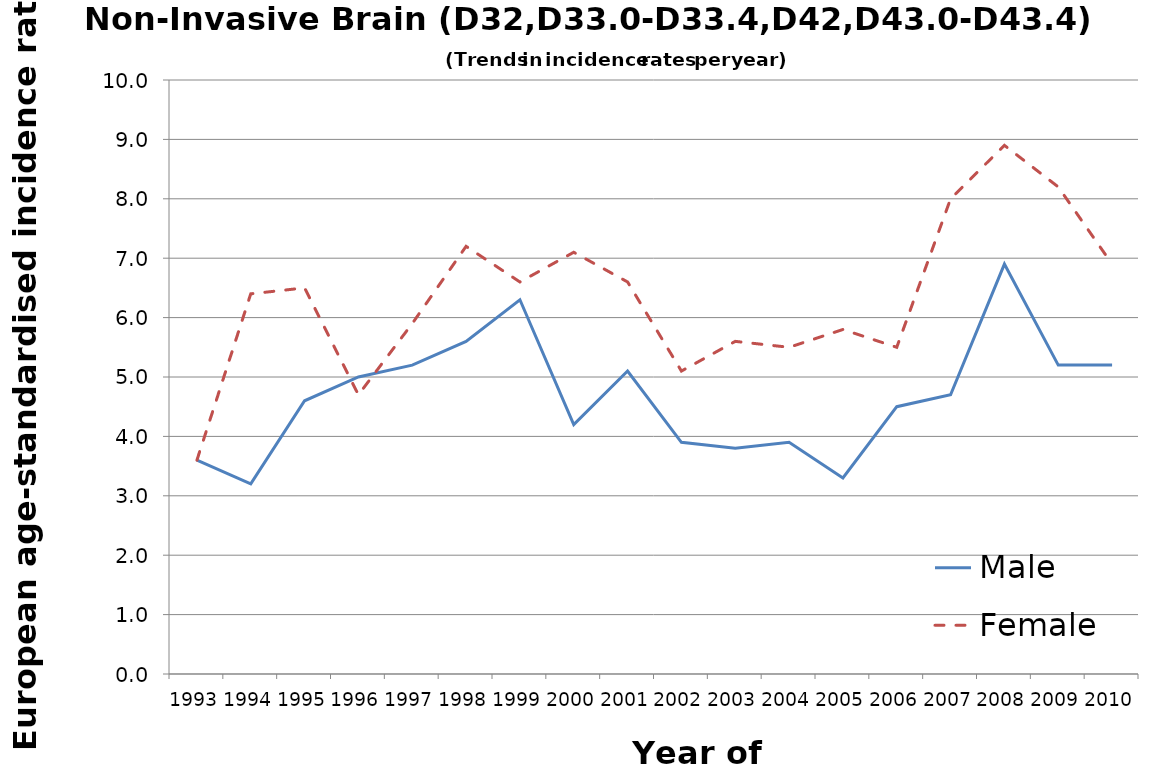
| Category | Male | Female |
|---|---|---|
| 1993.0 | 3.6 | 3.6 |
| 1994.0 | 3.2 | 6.4 |
| 1995.0 | 4.6 | 6.5 |
| 1996.0 | 5 | 4.7 |
| 1997.0 | 5.2 | 5.9 |
| 1998.0 | 5.6 | 7.2 |
| 1999.0 | 6.3 | 6.6 |
| 2000.0 | 4.2 | 7.1 |
| 2001.0 | 5.1 | 6.6 |
| 2002.0 | 3.9 | 5.1 |
| 2003.0 | 3.8 | 5.6 |
| 2004.0 | 3.9 | 5.5 |
| 2005.0 | 3.3 | 5.8 |
| 2006.0 | 4.5 | 5.5 |
| 2007.0 | 4.7 | 8 |
| 2008.0 | 6.9 | 8.9 |
| 2009.0 | 5.2 | 8.2 |
| 2010.0 | 5.2 | 6.9 |